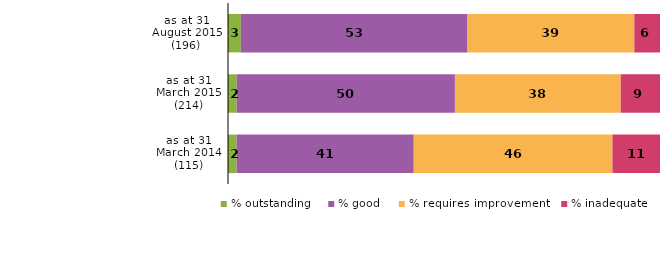
| Category | % outstanding | % good | % requires improvement | % inadequate |
|---|---|---|---|---|
| as at 31 August 2015 (196) | 3 | 53 | 39 | 6 |
| as at 31 March 2015 (214) | 2 | 50 | 38 | 9 |
| as at 31 March 2014 (115) | 2 | 41 | 46 | 11 |